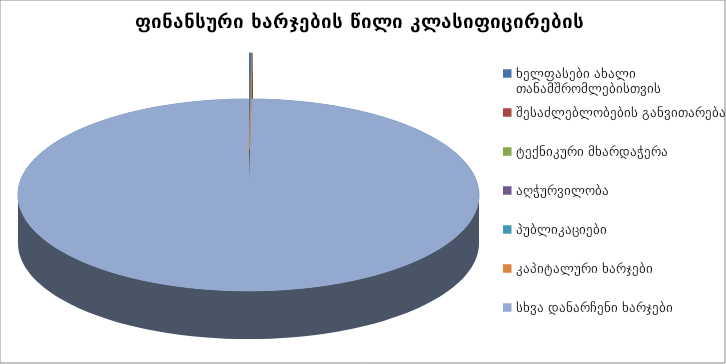
| Category | სულ |
|---|---|
| ხელფასები ახალი თანამშრომლებისთვის | 144000 |
| შესაძლებლობების განვითარება | 13960 |
| ტექნიკური მხარდაჭერა | 0 |
| აღჭურვილობა | 16500 |
| პუბლიკაციები | 120 |
| კაპიტალური ხარჯები | 0 |
| სხვა დანარჩენი ხარჯები | 84730719 |